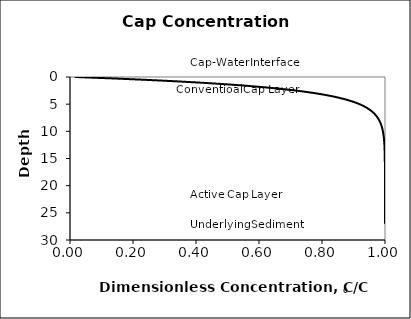
| Category | Series 0 |
|---|---|
| 0.015046236605992913 | 0 |
| 0.13937781279579264 | 0.27 |
| 0.24801491518171315 | 0.54 |
| 0.34293866981921395 | 0.81 |
| 0.4258801236278241 | 1.08 |
| 0.49835181208169166 | 1.35 |
| 0.561675342085127 | 1.62 |
| 0.6170054930395961 | 1.89 |
| 0.665351275613628 | 2.16 |
| 0.7075943322472479 | 2.43 |
| 0.7445050149459398 | 2.7 |
| 0.7767564335617402 | 2.97 |
| 0.8049367307485029 | 3.24 |
| 0.8295598074396883 | 3.51 |
| 0.8510746944404612 | 3.78 |
| 0.8698737410361754 | 4.05 |
| 0.8862997699462264 | 4.32 |
| 0.9006523291023167 | 4.59 |
| 0.9131931542597261 | 4.86 |
| 0.9241509420587616 | 5.13 |
| 0.933725520578824 | 5.4 |
| 0.9420914934400763 | 5.67 |
| 0.9494014239072298 | 5.94 |
| 0.9557886170613442 | 6.21 |
| 0.9613695507758444 | 6.48 |
| 0.9662459998284789 | 6.75 |
| 0.970506891884918 | 7.02 |
| 0.974229929200045 | 7.29 |
| 0.977483005610594 | 7.56 |
| 0.9803254446596628 | 7.83 |
| 0.9828090814317748 | 8.1 |
| 0.9849792078270295 | 8.37 |
| 0.9868753985125357 | 8.64 |
| 0.988532232613334 | 8.91 |
| 0.9899799243036893 | 9.18 |
| 0.9912448737983401 | 9.45 |
| 0.9923501487916776 | 9.72 |
| 0.9933159051244713 | 9.99 |
| 0.9941597543494924 | 10.26 |
| 0.9948970848990375 | 10.53 |
| 0.9955413427112128 | 10.8 |
| 0.9961042764325394 | 11.07 |
| 0.9965961516684354 | 11.34 |
| 0.9970259381886877 | 11.61 |
| 0.9974014735018264 | 11.88 |
| 0.9977296057813737 | 12.15 |
| 0.9980163187503991 | 12.42 |
| 0.9982668408017936 | 12.69 |
| 0.9984857403442081 | 12.96 |
| 0.9986770091123934 | 13.23 |
| 0.9988441349612108 | 13.5 |
| 0.9989901654707969 | 13.77 |
| 0.9991177635227954 | 14.04 |
| 0.9992292558611576 | 14.31 |
| 0.999326675523074 | 14.58 |
| 0.9994117989138144 | 14.85 |
| 0.9994861782015829 | 15.12 |
| 0.9995511696231416 | 15.39 |
| 0.9996079582163955 | 15.66 |
| 0.9996575794309612 | 15.93 |
| 0.999700938010817 | 16.2 |
| 0.9997388244933811 | 16.47 |
| 0.9997719296258974 | 16.74 |
| 0.9998008569620292 | 17.01 |
| 0.9998261338683755 | 17.28 |
| 0.9998482211416251 | 17.55 |
| 0.9998675214117301 | 17.82 |
| 0.9998843864843395 | 18.09 |
| 0.999899123756393 | 18.36 |
| 0.9999120018218662 | 18.63 |
| 0.9999232553699018 | 18.9 |
| 0.9999330894646429 | 19.17 |
| 0.9999416832848214 | 19.44 |
| 0.9999491933912925 | 19.71 |
| 0.9999557565821099 | 19.98 |
| 0.9999614923871981 | 20.25 |
| 0.9999665052481236 | 20.52 |
| 0.9999708864227097 | 20.79 |
| 0.9999747156492312 | 21.06 |
| 0.9999780626005365 | 21.33 |
| 0.999980988154614 | 21.6 |
| 0.999983545504775 | 21.87 |
| 0.9999857811296959 | 22.14 |
| 0.999987735641013 | 22.41 |
| 0.9999894445239222 | 22.68 |
| 0.9999909387842953 | 22.95 |
| 0.9999922455141079 | 23.22 |
| 0.9999933883854932 | 23.49 |
| 0.9999943880824326 | 23.76 |
| 0.9999952626779515 | 24.03 |
| 0.999996027963703 | 24.3 |
| 0.9999966977379466 | 24.57 |
| 0.999997284057177 | 24.84 |
| 0.9999978016865526 | 25.11 |
| 0.9999982590910427 | 25.38 |
| 0.9999986575642538 | 25.65 |
| 0.9999990046988 | 25.92 |
| 0.9999993071090744 | 26.19 |
| 0.9999995705572822 | 26.46 |
| 0.9999998000632351 | 26.73 |
| 1.0 | 27 |